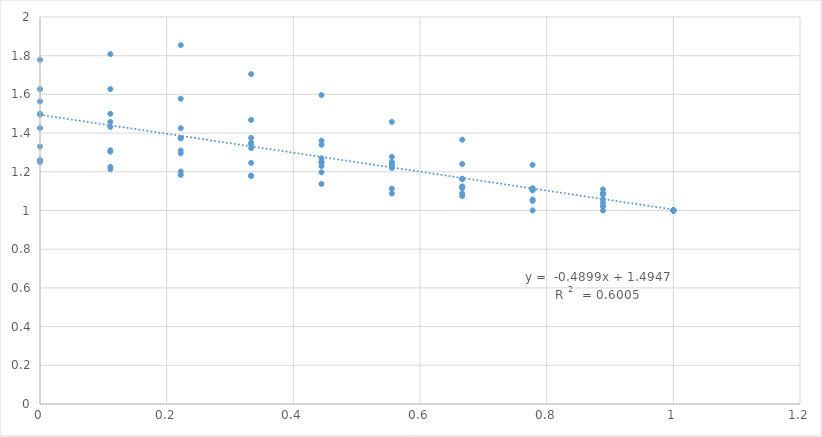
| Category | Series 0 |
|---|---|
| 1.0 | 1 |
| 0.8888889411764708 | 1 |
| 0.7777778823529415 | 1 |
| 0.6666668235294123 | 1.125 |
| 0.555555764705883 | 1.25 |
| 0.44444470588235374 | 1.25 |
| 0.3333336470588245 | 1.375 |
| 0.22222258823529528 | 1.375 |
| 0.11111152941176602 | 1.5 |
| 0.0 | 1.5 |
| 1.0 | 1 |
| 0.8888889411764708 | 1.082 |
| 0.7777778823529415 | 1.115 |
| 0.6666668235294123 | 1.115 |
| 0.555555764705883 | 1.23 |
| 0.44444470588235374 | 1.23 |
| 0.3333336470588245 | 1.246 |
| 0.22222258823529528 | 1.295 |
| 0.11111152941176602 | 1.311 |
| 0.0 | 1.426 |
| 1.0 | 1 |
| 0.8888889411764708 | 1.109 |
| 0.7777778823529415 | 1.236 |
| 0.6666668235294123 | 1.366 |
| 0.555555764705883 | 1.458 |
| 0.44444470588235374 | 1.596 |
| 0.3333336470588245 | 1.705 |
| 0.22222258823529528 | 1.855 |
| 0.11111152941176602 | 1.808 |
| 0.0 | 1.779 |
| 1.0 | 1 |
| 0.8888889411764708 | 1.058 |
| 0.7777778823529415 | 1.106 |
| 0.6666668235294123 | 1.164 |
| 0.555555764705883 | 1.22 |
| 0.44444470588235374 | 1.269 |
| 0.3333336470588245 | 1.323 |
| 0.22222258823529528 | 1.372 |
| 0.11111152941176602 | 1.432 |
| 0.0 | 1.495 |
| 1.0 | 1 |
| 0.8888889411764708 | 1.022 |
| 0.7777778823529415 | 1.107 |
| 0.6666668235294123 | 1.075 |
| 0.555555764705883 | 1.088 |
| 0.44444470588235374 | 1.197 |
| 0.3333336470588245 | 1.181 |
| 0.22222258823529528 | 1.184 |
| 0.11111152941176602 | 1.213 |
| 0.0 | 1.261 |
| 1.0 | 1 |
| 0.8888889411764708 | 1.089 |
| 0.7777778823529415 | 1.105 |
| 0.6666668235294123 | 1.123 |
| 0.555555764705883 | 1.249 |
| 0.44444470588235374 | 1.247 |
| 0.3333336470588245 | 1.351 |
| 0.22222258823529528 | 1.425 |
| 0.11111152941176602 | 1.458 |
| 0.0 | 1.564 |
| 1.0 | 1 |
| 0.8888889411764708 | 1.089 |
| 0.7777778823529415 | 1.05 |
| 0.6666668235294123 | 1.24 |
| 0.555555764705883 | 1.277 |
| 0.44444470588235374 | 1.361 |
| 0.3333336470588245 | 1.341 |
| 0.22222258823529528 | 1.31 |
| 0.11111152941176602 | 1.304 |
| 0.0 | 1.33 |
| 1.0 | 1 |
| 0.8888889411764708 | 1.04 |
| 0.7777778823529415 | 1.113 |
| 0.6666668235294123 | 1.162 |
| 0.555555764705883 | 1.236 |
| 0.44444470588235374 | 1.34 |
| 0.3333336470588245 | 1.468 |
| 0.22222258823529528 | 1.578 |
| 0.11111152941176602 | 1.627 |
| 0.0 | 1.627 |
| 1.0 | 1 |
| 0.8888889411764708 | 1.024 |
| 0.7777778823529415 | 1.056 |
| 0.6666668235294123 | 1.089 |
| 0.555555764705883 | 1.113 |
| 0.44444470588235374 | 1.137 |
| 0.3333336470588245 | 1.177 |
| 0.22222258823529528 | 1.202 |
| 0.11111152941176602 | 1.226 |
| 0.0 | 1.25 |